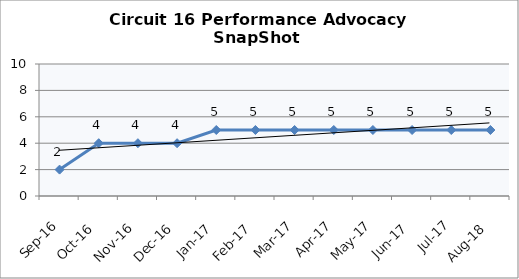
| Category | Circuit 16 |
|---|---|
| Sep-16 | 2 |
| Oct-16 | 4 |
| Nov-16 | 4 |
| Dec-16 | 4 |
| Jan-17 | 5 |
| Feb-17 | 5 |
| Mar-17 | 5 |
| Apr-17 | 5 |
| May-17 | 5 |
| Jun-17 | 5 |
| Jul-17 | 5 |
| Aug-18 | 5 |